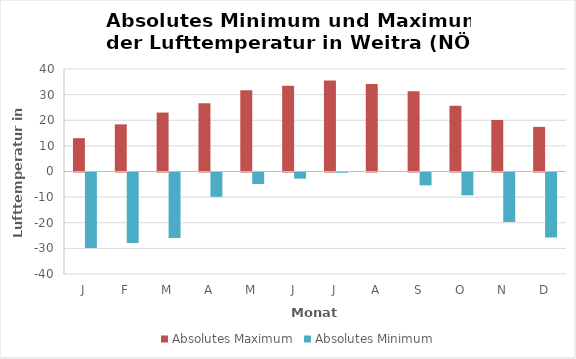
| Category | Absolutes Maximum | Absolutes Minimum |
|---|---|---|
| J | 13 | -29.5 |
| F | 18.4 | -27.5 |
| M | 23 | -25.6 |
| A | 26.6 | -9.5 |
| M | 31.7 | -4.5 |
| J | 33.5 | -2.4 |
| J | 35.5 | -0.1 |
| A | 34.1 | 0 |
| S | 31.3 | -5 |
| O | 25.7 | -8.9 |
| N | 20.1 | -19.3 |
| D | 17.4 | -25.4 |